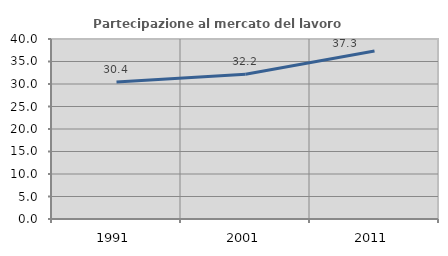
| Category | Partecipazione al mercato del lavoro  femminile |
|---|---|
| 1991.0 | 30.447 |
| 2001.0 | 32.168 |
| 2011.0 | 37.349 |